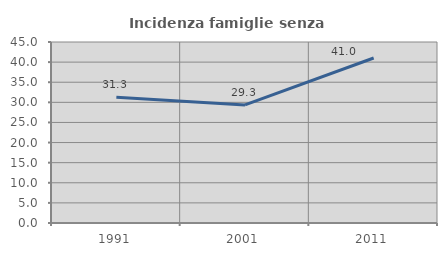
| Category | Incidenza famiglie senza nuclei |
|---|---|
| 1991.0 | 31.25 |
| 2001.0 | 29.35 |
| 2011.0 | 41.02 |